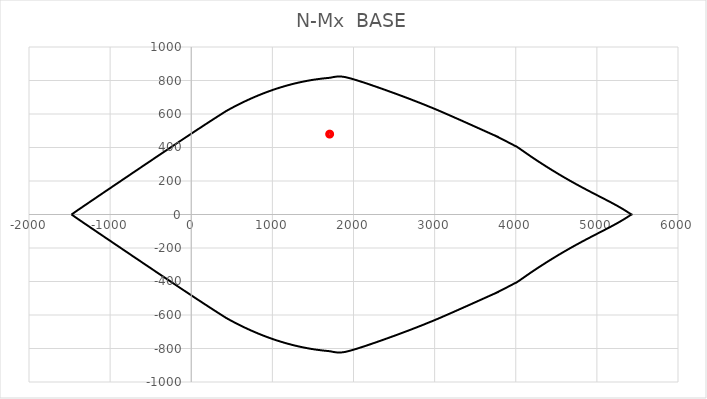
| Category | Series 2 |
|---|---|
| 1706.0 | 480 |